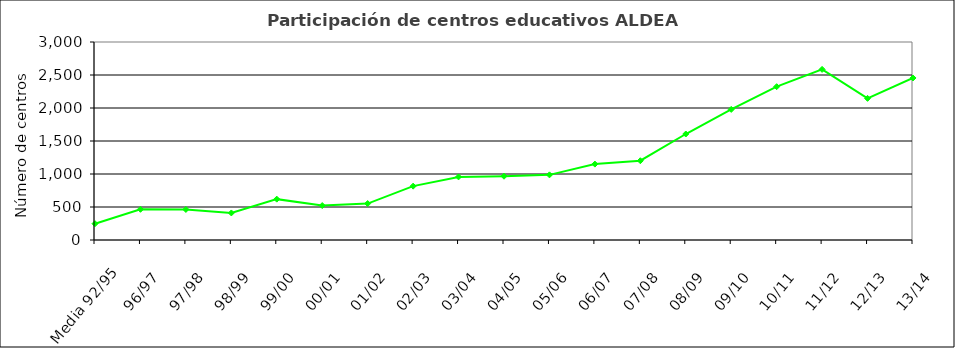
| Category | Series 0 |
|---|---|
| Media 92/95 | 247 |
| 96/97 | 465 |
| 97/98 | 463 |
| 98/99 | 410 |
| 99/00 | 619 |
| 00/01 | 522 |
| 01/02 | 552 |
| 02/03 | 816 |
| 03/04 | 956 |
| 04/05 | 966 |
| 05/06 | 987 |
| 06/07 | 1150 |
| 07/08 | 1201 |
| 08/09 | 1606 |
| 09/10 | 1979 |
| 10/11 | 2323 |
| 11/12 | 2585 |
| 12/13 | 2146 |
| 13/14 | 2455 |